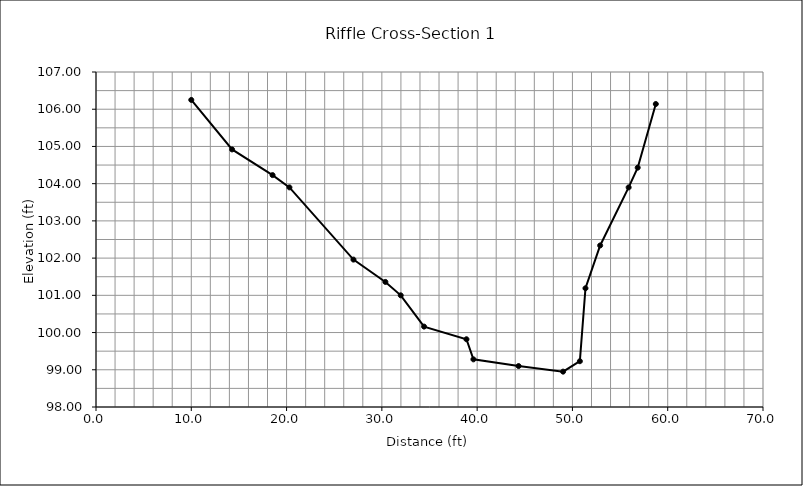
| Category | Series 0 |
|---|---|
| 10.0 | 106.25 |
| 14.28 | 104.92 |
| 18.53 | 104.23 |
| 20.3 | 103.9 |
| 27.02 | 101.96 |
| 30.37 | 101.36 |
| 31.98 | 101 |
| 34.43 | 100.16 |
| 38.88 | 99.82 |
| 39.61 | 99.28 |
| 44.35 | 99.1 |
| 49.02 | 98.95 |
| 50.78 | 99.23 |
| 51.37 | 101.19 |
| 52.91 | 102.34 |
| 55.9 | 103.9 |
| 56.85 | 104.43 |
| 58.75 | 106.14 |